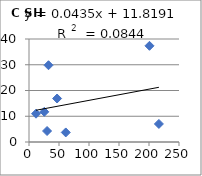
| Category | C SH  |
|---|---|
| 25.5 | 11.72 |
| 61.3 | 3.71 |
| 11.7 | 10.99 |
| 216.5 | 7.01 |
| 46.8 | 16.89 |
| 32.5 | 29.81 |
| 200.8 | 37.36 |
| 30.1 | 4.27 |